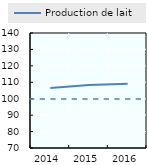
| Category | Production de lait |
|---|---|
| 2014.0 | 106.586 |
| 2015.0 | 108.338 |
| 2016.0 | 109.118 |